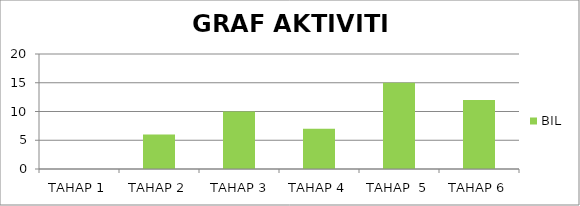
| Category | BIL |
|---|---|
| TAHAP 1 | 0 |
| TAHAP 2 | 6 |
|  TAHAP 3 | 10 |
| TAHAP 4 | 7 |
| TAHAP  5 | 15 |
| TAHAP 6 | 12 |